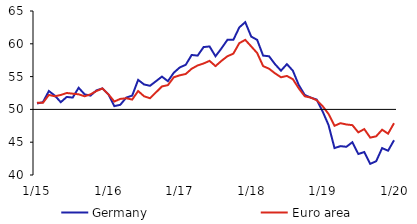
| Category | Germany | Euro area |
|---|---|---|
|  1/15 | 50.9 | 51 |
| 2 | 51.1 | 51 |
| 3 | 52.8 | 52.2 |
| 4 | 52.1 | 52 |
| 5 | 51.1 | 52.2 |
| 6 | 51.9 | 52.5 |
| 7 | 51.8 | 52.4 |
| 8 | 53.3 | 52.3 |
| 9 | 52.3 | 52 |
| 10 | 52.1 | 52.3 |
| 11 | 52.9 | 52.8 |
| 12 | 53.2 | 53.2 |
|  1/16 | 52.3 | 52.3 |
| 2 | 50.5 | 51.2 |
| 3 | 50.7 | 51.6 |
| 4 | 51.8 | 51.7 |
| 5 | 52.1 | 51.5 |
| 6 | 54.5 | 52.8 |
| 7 | 53.8 | 52 |
| 8 | 53.6 | 51.7 |
| 9 | 54.3 | 52.6 |
| 10 | 55 | 53.5 |
| 11 | 54.3 | 53.7 |
| 12 | 55.6 | 54.9 |
|  1/17 | 56.4 | 55.2 |
| 2 | 56.8 | 55.4 |
| 3 | 58.3 | 56.2 |
| 4 | 58.2 | 56.7 |
| 5 | 59.5 | 57 |
| 6 | 59.6 | 57.4 |
| 7 | 58.1 | 56.6 |
| 8 | 59.3 | 57.4 |
| 9 | 60.6 | 58.1 |
| 10 | 60.6 | 58.5 |
| 11 | 62.5 | 60.1 |
| 12 | 63.3 | 60.6 |
|  1/18 | 61.1 | 59.6 |
| 2 | 60.6 | 58.6 |
| 3 | 58.2 | 56.6 |
| 4 | 58.1 | 56.2 |
| 5 | 56.9 | 55.5 |
| 6 | 55.9 | 54.9 |
| 7 | 56.9 | 55.1 |
| 8 | 55.9 | 54.6 |
| 9 | 53.7 | 53.2 |
| 10 | 52.2 | 52 |
| 11 | 51.8 | 51.8 |
| 12 | 51.5 | 51.4 |
|  1/19 | 49.7 | 50.5 |
| 2 | 47.6 | 49.3 |
| 3 | 44.1 | 47.5 |
| 4 | 44.4 | 47.9 |
| 5 | 44.3 | 47.7 |
| 6 | 45 | 47.6 |
| 7 | 43.2 | 46.5 |
| 8 | 43.5 | 47 |
| 9 | 41.7 | 45.7 |
| 10 | 42.1 | 45.9 |
| 11 | 44.1 | 46.9 |
| 12 | 43.7 | 46.3 |
|  1/20 | 45.3 | 47.9 |